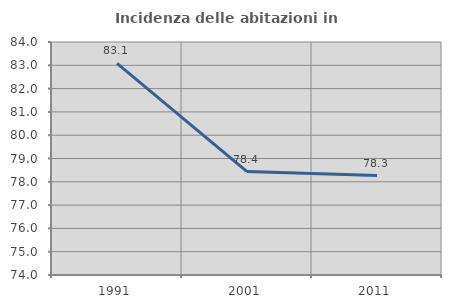
| Category | Incidenza delle abitazioni in proprietà  |
|---|---|
| 1991.0 | 83.086 |
| 2001.0 | 78.439 |
| 2011.0 | 78.266 |